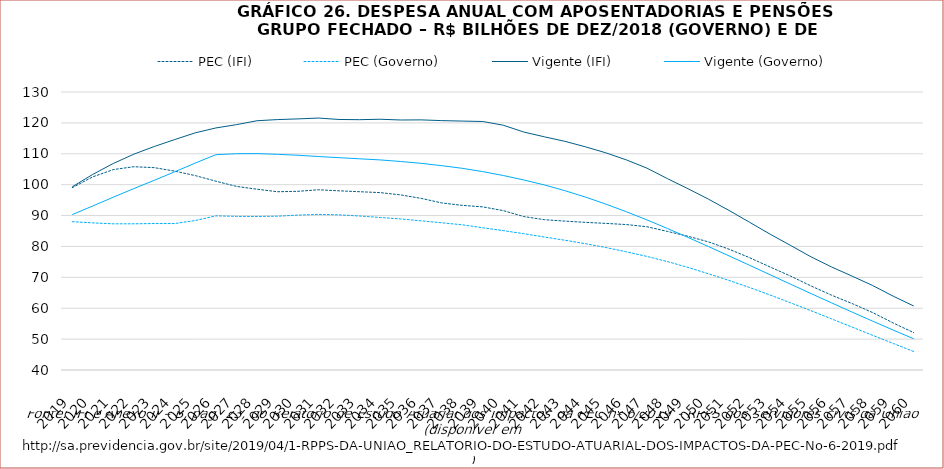
| Category | PEC (IFI) | PEC (Governo) | Vigente (IFI) | Vigente (Governo) |
|---|---|---|---|---|
| 2019.0 | 99020931960.11 | 88017383645.708 | 99312764975.717 | 90302904921 |
| 2020.0 | 102528606726.985 | 87628468935.346 | 103322328962.247 | 93101526096 |
| 2021.0 | 104880288316.188 | 87323813140.615 | 106863556736.48 | 95937310315 |
| 2022.0 | 105810268058.543 | 87332988184.681 | 109870527916.364 | 98737425738 |
| 2023.0 | 105506399516.951 | 87413690979.483 | 112363309757.279 | 101422272621 |
| 2024.0 | 104370898415.554 | 87417970453.669 | 114619317397.191 | 104190724347 |
| 2025.0 | 102922462437.356 | 88399769821.418 | 116800942941.284 | 107011064450 |
| 2026.0 | 101122766803.295 | 89911104948.944 | 118361750666.476 | 109700876419 |
| 2027.0 | 99437169680.174 | 89728459142.848 | 119429953126.77 | 110027825763 |
| 2028.0 | 98528062124.301 | 89696148191.11 | 120696785475.762 | 110061092109 |
| 2029.0 | 97712136361.552 | 89790928992.363 | 121067687292.128 | 109826112995 |
| 2030.0 | 97848954327.123 | 90155128353.833 | 121299079146.364 | 109526719910 |
| 2031.0 | 98348477468.569 | 90378240201.314 | 121564632041.104 | 109103716830 |
| 2032.0 | 98004309017.197 | 90230234977.191 | 121106348489.062 | 108737981495 |
| 2033.0 | 97714567831.177 | 89855349658.443 | 121038264403.37 | 108372676611 |
| 2034.0 | 97428901904.697 | 89374390188.466 | 121179137623.656 | 108013679532 |
| 2035.0 | 96682988615.843 | 88903843390.87 | 120940281916.012 | 107495620806 |
| 2036.0 | 95560041873.456 | 88295923096.323 | 120975480434.197 | 106898705453 |
| 2037.0 | 94093907148.042 | 87661446960.082 | 120735666057.381 | 106150384179 |
| 2038.0 | 93297780895.574 | 87001444329.324 | 120591160432.63 | 105295323609 |
| 2039.0 | 92811233211.903 | 86052079397.878 | 120449373664.016 | 104223263053 |
| 2040.0 | 91596538302.157 | 85128869336.329 | 119248305007.006 | 102966744504 |
| 2041.0 | 89674782720.571 | 84121784528.615 | 117035728837.541 | 101519167411 |
| 2042.0 | 88664358560.636 | 83060441478.201 | 115498108058.622 | 99917512661 |
| 2043.0 | 88199614621.99 | 82010565275.586 | 114033094356.123 | 98062313161 |
| 2044.0 | 87797083572.164 | 80891703671.237 | 112262905606.571 | 95995358995 |
| 2045.0 | 87462801128.88 | 79657719840.153 | 110307096810.256 | 93692955154 |
| 2046.0 | 87082030017.786 | 78257701720.796 | 108013841974.586 | 91233350108 |
| 2047.0 | 86379848692.955 | 76768648602.503 | 105346085921.72 | 88597831822 |
| 2048.0 | 84863391843.816 | 75103852433.98 | 101945857208.568 | 85811286663 |
| 2049.0 | 83302592923.252 | 73219844443.949 | 98692343008.594 | 82921702769 |
| 2050.0 | 81475310164.354 | 71148942704.362 | 95303776997.03 | 79964150470 |
| 2051.0 | 79108223770.811 | 68991487947.247 | 91656084545.624 | 76950692862 |
| 2052.0 | 76359903948.253 | 66704012411.431 | 87837642989.498 | 73905294133 |
| 2053.0 | 73349144449.418 | 64277718982.058 | 83981601919.22 | 70839217639 |
| 2054.0 | 70403218885.646 | 61752096546.785 | 80330903591.391 | 67776401417 |
| 2055.0 | 67196228808.851 | 59174230649.388 | 76608614224.957 | 64731542553 |
| 2056.0 | 64211325872.041 | 56540756103.04 | 73342396725.437 | 61716367672 |
| 2057.0 | 61507968350.576 | 53887394724.362 | 70379305637.269 | 58740308639 |
| 2058.0 | 58579985718.929 | 51228023668.016 | 67345565154.111 | 55809928173 |
| 2059.0 | 55225580953.133 | 48591286063.928 | 63900381084.508 | 52929821659 |
| 2060.0 | 52086799467.39 | 45985643922.531 | 60717547487.849 | 50103916153 |